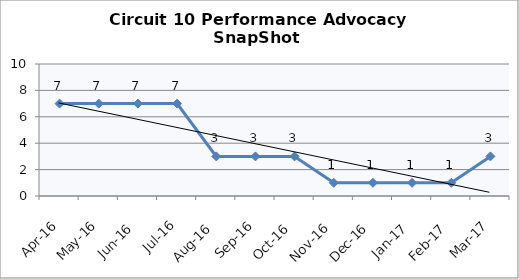
| Category | Circuit 10 |
|---|---|
| Apr-16 | 7 |
| May-16 | 7 |
| Jun-16 | 7 |
| Jul-16 | 7 |
| Aug-16 | 3 |
| Sep-16 | 3 |
| Oct-16 | 3 |
| Nov-16 | 1 |
| Dec-16 | 1 |
| Jan-17 | 1 |
| Feb-17 | 1 |
| Mar-17 | 3 |